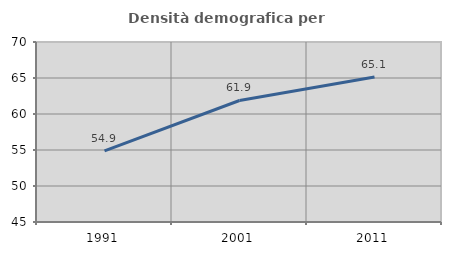
| Category | Densità demografica |
|---|---|
| 1991.0 | 54.888 |
| 2001.0 | 61.876 |
| 2011.0 | 65.129 |